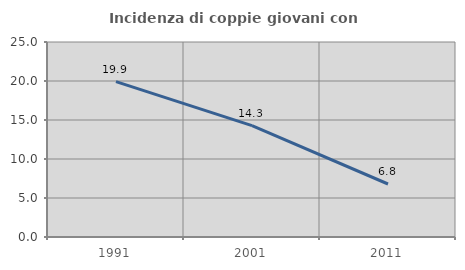
| Category | Incidenza di coppie giovani con figli |
|---|---|
| 1991.0 | 19.922 |
| 2001.0 | 14.286 |
| 2011.0 | 6.795 |